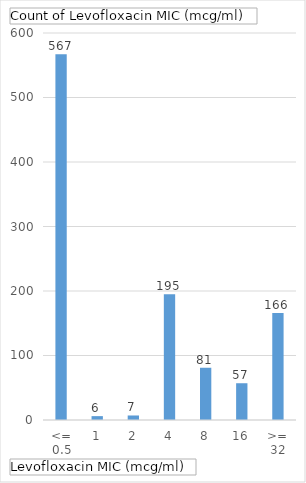
| Category | Total |
|---|---|
| <= 0.5 | 567 |
| 1 | 6 |
| 2 | 7 |
| 4 | 195 |
| 8 | 81 |
| 16 | 57 |
| >= 32 | 166 |